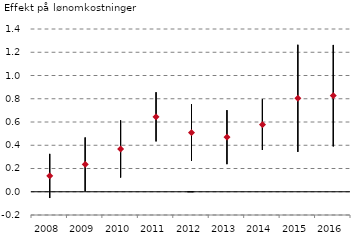
| Category | Serie 1 | Serie 2 | Serie 3 |
|---|---|---|---|
| 2008.0 | 0.326 | -0.054 | 0.136 |
| 2009.0 | 0.467 | 0.003 | 0.235 |
| 2010.0 | 0.614 | 0.122 | 0.368 |
| 2011.0 | 0.856 | 0.433 | 0.645 |
| 2012.0 | 0.753 | 0.266 | 0.509 |
| 2013.0 | 0.702 | 0.237 | 0.47 |
| 2014.0 | 0.795 | 0.359 | 0.577 |
| 2015.0 | 1.264 | 0.343 | 0.804 |
| 2016.0 | 1.263 | 0.39 | 0.826 |